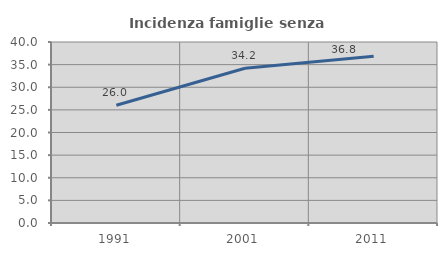
| Category | Incidenza famiglie senza nuclei |
|---|---|
| 1991.0 | 26.036 |
| 2001.0 | 34.211 |
| 2011.0 | 36.838 |